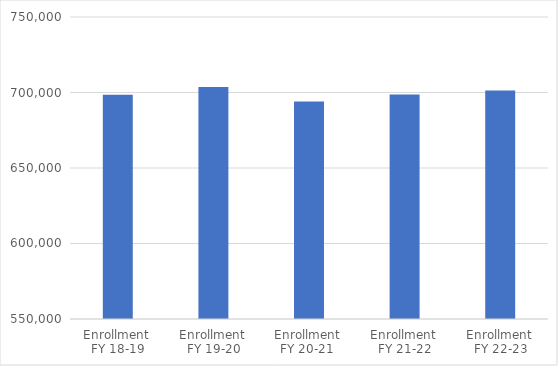
| Category | Series 0 |
|---|---|
| Enrollment 
FY 22-23 | 701258 |
| Enrollment 
FY 21-22 | 698696 |
| Enrollment 
FY 20-21  | 694113 |
| Enrollment 
FY 19-20 | 703650 |
| Enrollment 
FY 18-19 | 698586 |